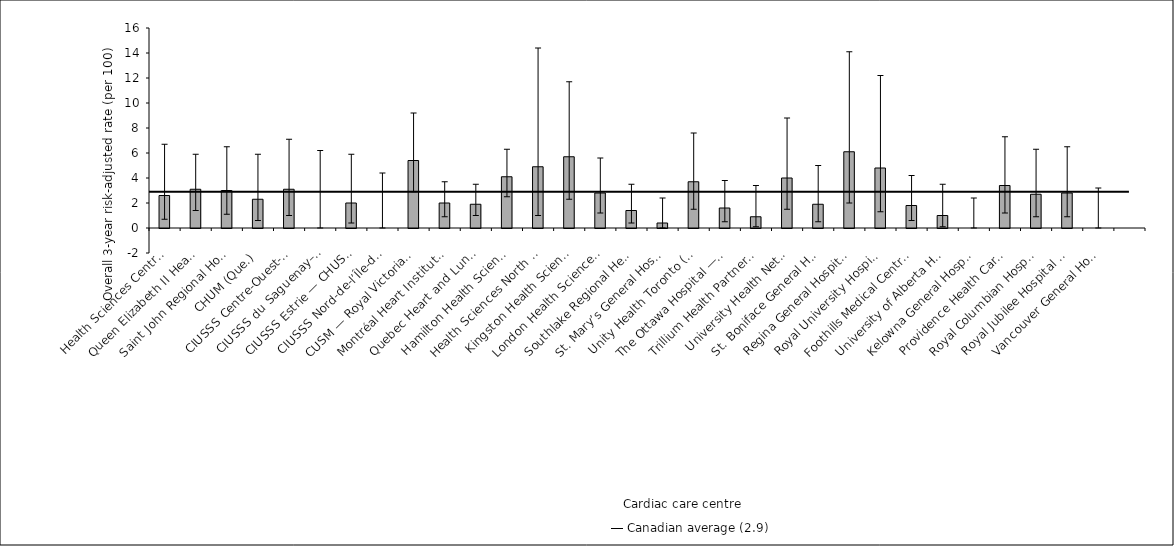
| Category | Risk-adjusted rate |
|---|---|
| Health Sciences Centre, St. John’s (N.L.) | 2.6 |
| Queen Elizabeth II Health Sciences Centre (N.S.) | 3.1 |
| Saint John Regional Hospital (N.B.) | 3 |
| CHUM (Que.) | 2.3 |
| CIUSSS Centre-Ouest-de-l’Île-de-Montréal — Jewish General Hospital (Que.) | 3.1 |
| CIUSSS du Saguenay–Lac-St-Jean — Chicoutimi Hospital (Que.) | 0 |
| CIUSSS Estrie — CHUS — Fleurimont Hospital (Que.) | 2 |
| CIUSSS Nord-de-l’Île-de-Montréal — Montréal Sacré-Coeur Hospital (Que.) | 0 |
| CUSM — Royal Victoria Hospital (Que.) | 5.4 |
| Montréal Heart Institute (Que.) | 2 |
| Quebec Heart and Lung Institute (Que.) | 1.9 |
| Hamilton Health Sciences (Ont.) | 4.1 |
| Health Sciences North / Horizon Santé-Nord (Ont.) | 4.9 |
| Kingston Health Sciences Centre (Ont.) | 5.7 |
| London Health Sciences Centre (Ont.) | 2.8 |
| Southlake Regional Health Centre (Ont.) | 1.4 |
| St. Mary’s General Hospital* (Ont.) | 0.4 |
| Unity Health Toronto (Ont.) | 3.7 |
| The Ottawa Hospital — University of Ottawa Heart Institute (Ont.) | 1.6 |
| Trillium Health Partners (Ont.) | 0.9 |
| University Health Network (Ont.) | 4 |
| St. Boniface General Hospital (Man.) | 1.9 |
| Regina General Hospital (Sask.) | 6.1 |
| Royal University Hospital (Sask.) | 4.8 |
| Foothills Medical Centre (Alta.) | 1.8 |
| University of Alberta Hospital (Alta.) | 1 |
| Kelowna General Hospital* (B.C.) | 0 |
| Providence Health Care — St. Paul’s Hospital (Vancouver) (B.C.) | 3.4 |
| Royal Columbian Hospital (B.C.) | 2.7 |
| Royal Jubilee Hospital (B.C.) | 2.8 |
| Vancouver General Hospital (B.C.) | 0 |